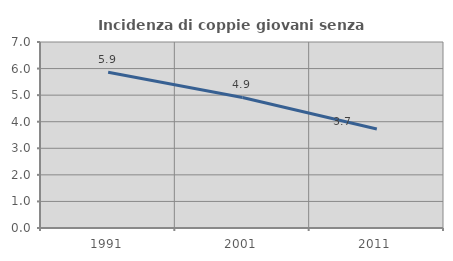
| Category | Incidenza di coppie giovani senza figli |
|---|---|
| 1991.0 | 5.865 |
| 2001.0 | 4.913 |
| 2011.0 | 3.726 |